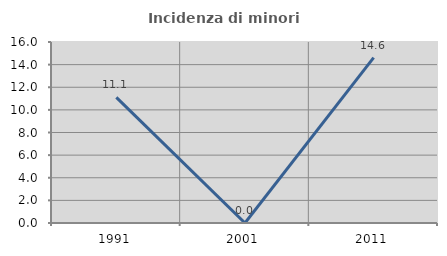
| Category | Incidenza di minori stranieri |
|---|---|
| 1991.0 | 11.111 |
| 2001.0 | 0 |
| 2011.0 | 14.615 |